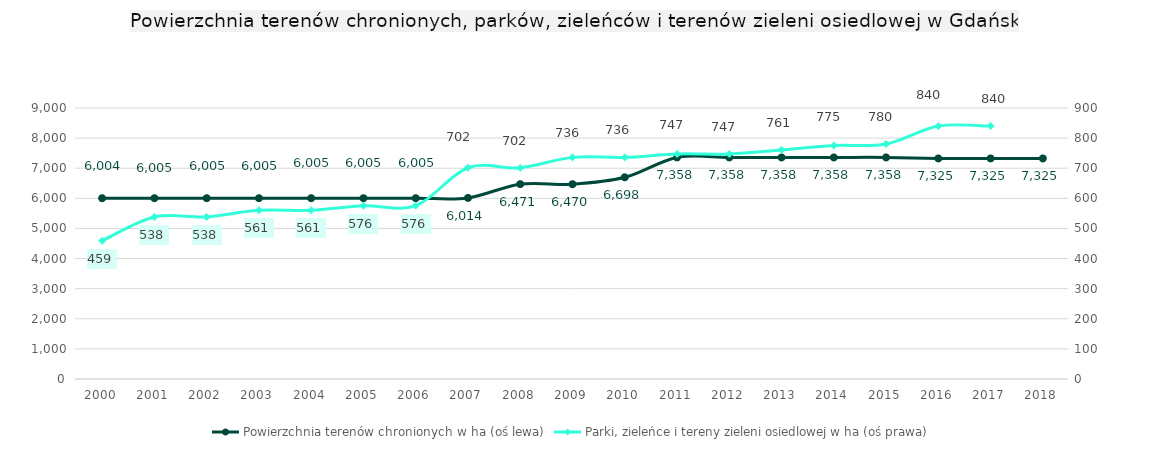
| Category | Powierzchnia terenów chronionych w ha (oś lewa) |
|---|---|
| 2000.0 | 6004 |
| 2001.0 | 6005 |
| 2002.0 | 6005.2 |
| 2003.0 | 6005.3 |
| 2004.0 | 6005.3 |
| 2005.0 | 6005 |
| 2006.0 | 6005 |
| 2007.0 | 6013.6 |
| 2008.0 | 6471.3 |
| 2009.0 | 6469.7 |
| 2010.0 | 6697.92 |
| 2011.0 | 7358 |
| 2012.0 | 7358 |
| 2013.0 | 7358 |
| 2014.0 | 7358 |
| 2015.0 | 7358 |
| 2016.0 | 7325.11 |
| 2017.0 | 7325.11 |
| 2018.0 | 7325.11 |